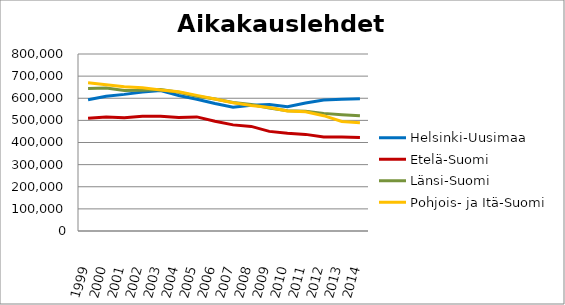
| Category | Helsinki-Uusimaa | Etelä-Suomi | Länsi-Suomi | Pohjois- ja Itä-Suomi |
|---|---|---|---|---|
| 1999.0 | 592834 | 510081 | 644506 | 669775 |
| 2000.0 | 608920 | 515313 | 646099 | 661106 |
| 2001.0 | 617513 | 512218 | 635178 | 652006 |
| 2002.0 | 628718 | 518798 | 635657 | 647012 |
| 2003.0 | 634667 | 518249 | 639305 | 637673 |
| 2004.0 | 612696 | 512653 | 627097 | 629605 |
| 2005.0 | 595272 | 515645 | 608696 | 612991 |
| 2006.0 | 575956 | 496176 | 596940 | 596689 |
| 2007.0 | 559221 | 479666 | 581079 | 579630 |
| 2008.0 | 568299 | 472735 | 571542 | 566789 |
| 2009.0 | 571559 | 450278 | 555507 | 558532 |
| 2010.0 | 561706 | 441315 | 543234 | 542841 |
| 2011.0 | 578596 | 436667 | 541347 | 538726 |
| 2012.0 | 592341 | 425020 | 531622 | 521315 |
| 2013.0 | 595190 | 425321 | 525411 | 494717 |
| 2014.0 | 598135 | 422855 | 520884 | 489191 |